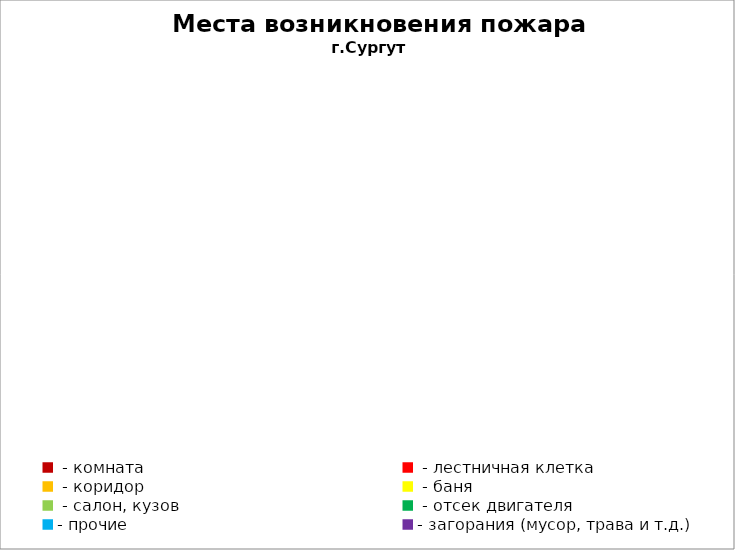
| Category | Места возникновения пожара |
|---|---|
|  - комната | 49 |
|  - лестничная клетка | 18 |
|  - коридор | 9 |
|  - баня | 21 |
|  - салон, кузов | 10 |
|  - отсек двигателя | 25 |
| - прочие | 99 |
| - загорания (мусор, трава и т.д.)  | 156 |